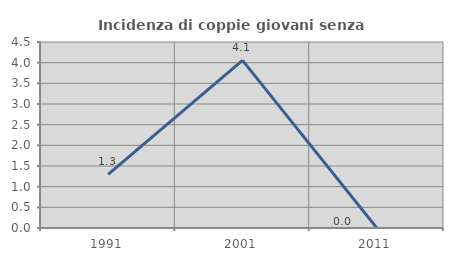
| Category | Incidenza di coppie giovani senza figli |
|---|---|
| 1991.0 | 1.299 |
| 2001.0 | 4.054 |
| 2011.0 | 0 |